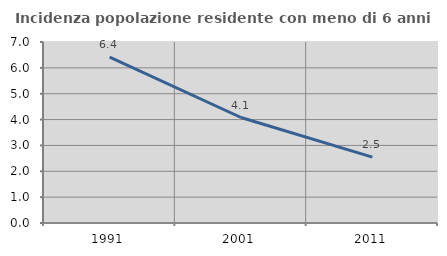
| Category | Incidenza popolazione residente con meno di 6 anni |
|---|---|
| 1991.0 | 6.419 |
| 2001.0 | 4.08 |
| 2011.0 | 2.547 |